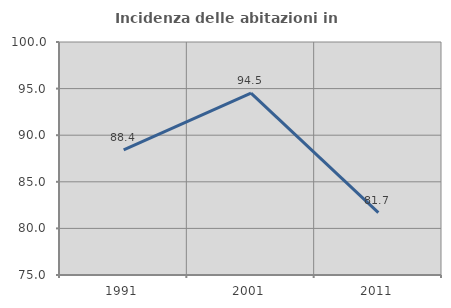
| Category | Incidenza delle abitazioni in proprietà  |
|---|---|
| 1991.0 | 88.421 |
| 2001.0 | 94.521 |
| 2011.0 | 81.69 |